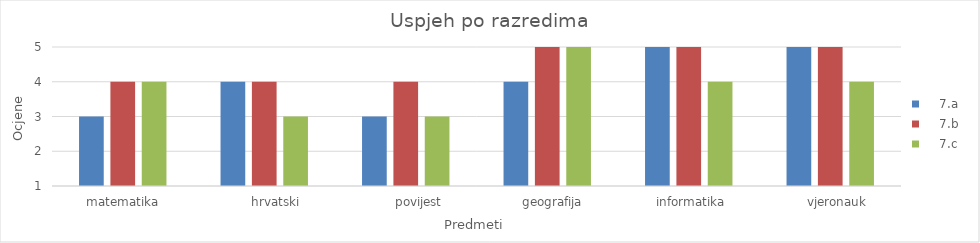
| Category |     7.a |     7.b  |     7.c |
|---|---|---|---|
|  matematika | 3 | 4 | 4 |
|       hrvatski | 4 | 4 | 3 |
|        povijest | 3 | 4 | 3 |
|    geografija | 4 | 5 | 5 |
|   informatika | 5 | 5 | 4 |
|     vjeronauk | 5 | 5 | 4 |